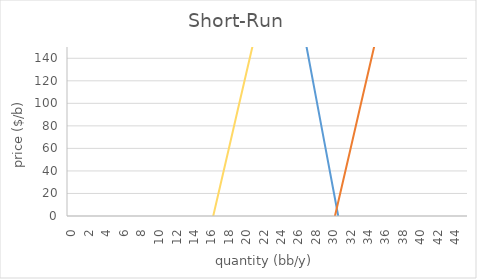
| Category | SR Tot Dem | SR Tot Sup | LR Tot Sup |
|---|---|---|---|
| 0.0 | 1260 | -1006.667 | -540 |
| 1.0 | 1218.791 | -973.333 | -506.667 |
| 2.0 | 1177.582 | -940 | -473.333 |
| 3.0 | 1136.374 | -906.667 | -440 |
| 4.0 | 1095.165 | -873.333 | -406.667 |
| 5.0 | 1053.956 | -840 | -373.333 |
| 6.0 | 1012.747 | -806.667 | -340 |
| 7.0 | 971.538 | -773.333 | -306.667 |
| 8.0 | 930.33 | -740 | -273.333 |
| 9.0 | 889.121 | -706.667 | -240 |
| 10.0 | 847.912 | -673.333 | -206.667 |
| 11.0 | 806.703 | -640 | -173.333 |
| 12.0 | 765.495 | -606.667 | -140 |
| 13.0 | 724.286 | -573.333 | -106.667 |
| 14.0 | 683.077 | -540 | -73.333 |
| 15.0 | 641.868 | -506.667 | -40 |
| 16.0 | 600.659 | -473.333 | -6.667 |
| 17.0 | 559.451 | -440 | 26.667 |
| 18.0 | 518.242 | -406.667 | 60 |
| 19.0 | 477.033 | -373.333 | 93.333 |
| 20.0 | 435.824 | -340 | 126.667 |
| 21.0 | 394.615 | -306.667 | 160 |
| 22.0 | 353.407 | -273.333 | 193.333 |
| 23.0 | 312.198 | -240 | 226.667 |
| 24.0 | 270.989 | -206.667 | 260 |
| 25.0 | 229.78 | -173.333 | 293.333 |
| 26.0 | 188.571 | -140 | 326.667 |
| 27.0 | 147.363 | -106.667 | 360 |
| 28.0 | 106.154 | -73.333 | 393.333 |
| 29.0 | 64.945 | -40 | 426.667 |
| 30.0 | 23.736 | -6.667 | 460 |
| 31.0 | -17.473 | 26.667 | 493.333 |
| 32.0 | -58.681 | 60 | 526.667 |
| 33.0 | -99.89 | 93.333 | 560 |
| 34.0 | -141.099 | 126.667 | 593.333 |
| 35.0 | -182.308 | 160 | 626.667 |
| 36.0 | -223.516 | 193.333 | 660 |
| 37.0 | -264.725 | 226.667 | 693.333 |
| 38.0 | -305.934 | 260 | 726.667 |
| 39.0 | -347.143 | 293.333 | 760 |
| 40.0 | -388.352 | 326.667 | 793.333 |
| 41.0 | -429.56 | 360 | 826.667 |
| 42.0 | -470.769 | 393.333 | 860 |
| 43.0 | -511.978 | 426.667 | 893.333 |
| 44.0 | -553.187 | 460 | 926.667 |
| 45.0 | -594.396 | 493.333 | 960 |